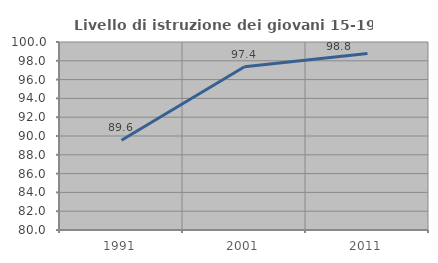
| Category | Livello di istruzione dei giovani 15-19 anni |
|---|---|
| 1991.0 | 89.556 |
| 2001.0 | 97.368 |
| 2011.0 | 98.765 |